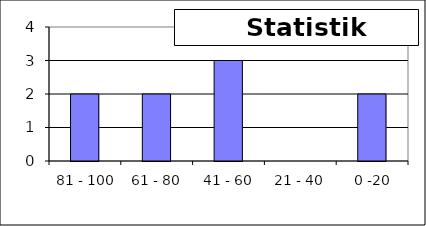
| Category | Series 0 |
|---|---|
|  81 - 100 | 2 |
| 61 - 80 | 2 |
| 41 - 60 | 3 |
| 21 - 40 | 0 |
|  0 -20 | 2 |